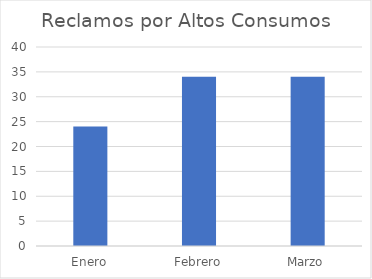
| Category | Reclamos por Altos Consumos |
|---|---|
| Enero | 24 |
| Febrero | 34 |
| Marzo | 34 |